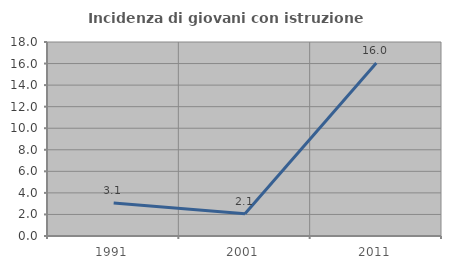
| Category | Incidenza di giovani con istruzione universitaria |
|---|---|
| 1991.0 | 3.061 |
| 2001.0 | 2.062 |
| 2011.0 | 16.049 |